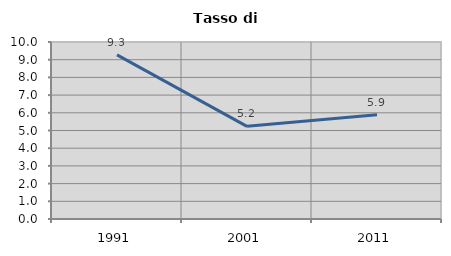
| Category | Tasso di disoccupazione   |
|---|---|
| 1991.0 | 9.273 |
| 2001.0 | 5.235 |
| 2011.0 | 5.893 |